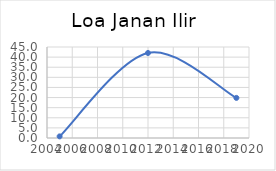
| Category | Series 0 |
|---|---|
| 2005.0 | 0.801 |
| 2012.0 | 42.038 |
| 2019.0 | 19.831 |